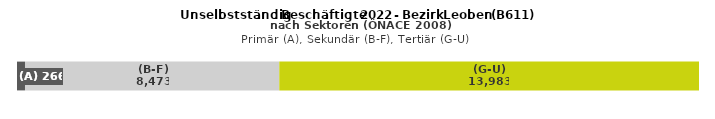
| Category | (A) | (B-F) | (G-U) |
|---|---|---|---|
| 0 | 266 | 8473 | 13983 |